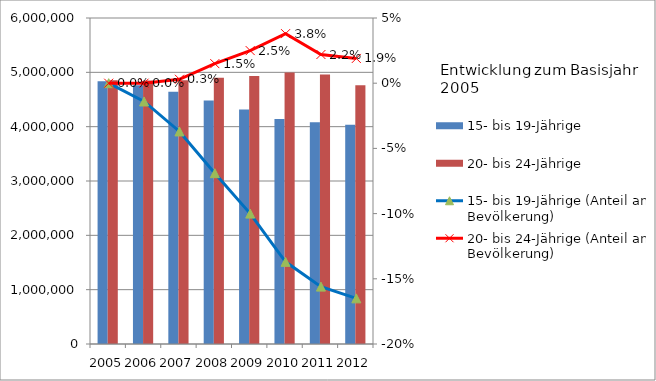
| Category | 15- bis 19-Jährige | 20- bis 24-Jährige |
|---|---|---|
| 2005.0 | 4835789 | 4853808 |
| 2006.0 | 4762364 | 4848270 |
| 2007.0 | 4642964 | 4855500 |
| 2008.0 | 4479630 | 4899839 |
| 2009.0 | 4317072 | 4934457 |
| 2010.0 | 4140394 | 4995991 |
| 2011.0 | 4080462 | 4959920 |
| 2012.0 | 4037000 | 4762000 |